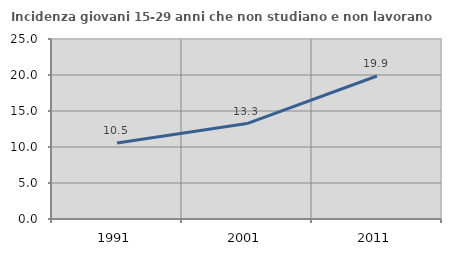
| Category | Incidenza giovani 15-29 anni che non studiano e non lavorano  |
|---|---|
| 1991.0 | 10.543 |
| 2001.0 | 13.255 |
| 2011.0 | 19.861 |